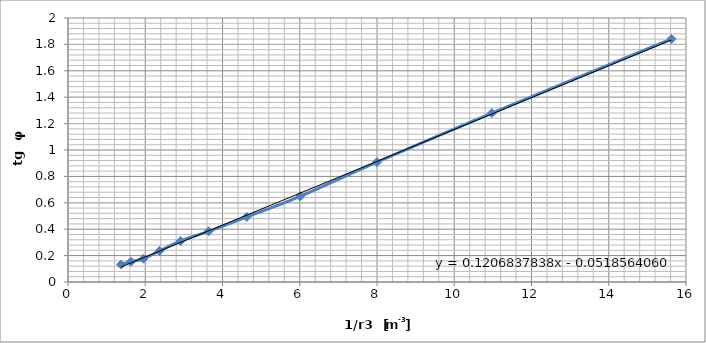
| Category | Series 0 |
|---|---|
| 1.371742112482853 | 0.132 |
| 1.628332994097293 | 0.154 |
| 1.9531249999999996 | 0.176 |
| 2.3703703703703702 | 0.235 |
| 2.9154518950437325 | 0.311 |
| 3.6413290851160665 | 0.384 |
| 4.62962962962963 | 0.493 |
| 6.01051840721262 | 0.649 |
| 8.0 | 0.908 |
| 10.973936899862824 | 1.28 |
| 15.624999999999996 | 1.842 |